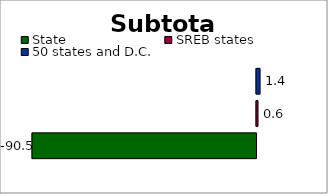
| Category | State | SREB states | 50 states and D.C. |
|---|---|---|---|
| 0 | -90.505 | 0.615 | 1.447 |